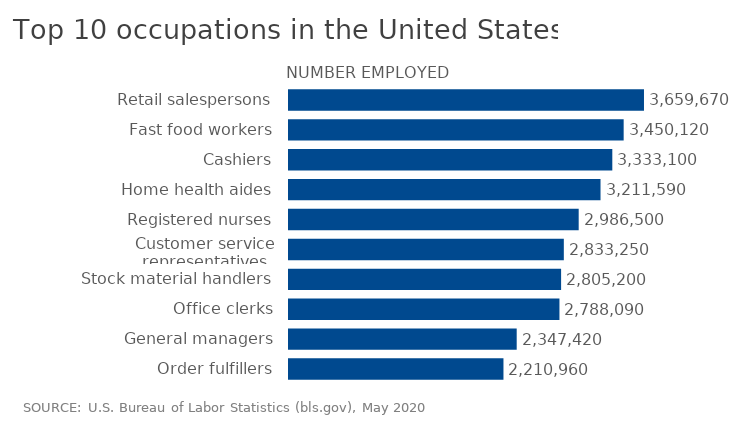
| Category | Series 0 |
|---|---|
| Retail salespersons | 3659670 |
| Fast food workers | 3450120 |
| Cashiers | 3333100 |
| Home health aides | 3211590 |
| Registered nurses | 2986500 |
| Customer service representatives | 2833250 |
| Stock material handlers | 2805200 |
| Office clerks | 2788090 |
| General managers | 2347420 |
| Order fulfillers | 2210960 |